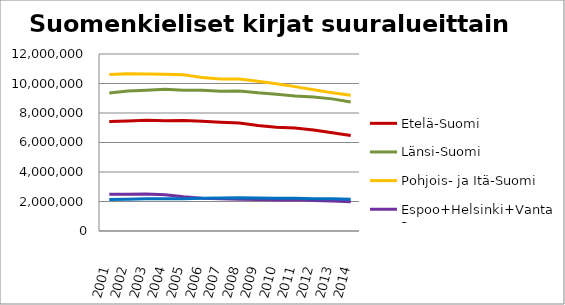
| Category | Etelä-Suomi | Länsi-Suomi | Pohjois- ja Itä-Suomi | Espoo+Helsinki+Vantaa | Muu Uusimaa |
|---|---|---|---|---|---|
| 2001.0 | 7427465 | 9358423 | 10606272 | 2489051 | 2136193 |
| 2002.0 | 7465703 | 9485230 | 10656582 | 2497956 | 2160577 |
| 2003.0 | 7504008 | 9540448 | 10639796 | 2510049 | 2187037 |
| 2004.0 | 7474227 | 9605493 | 10624606 | 2456765 | 2183677 |
| 2005.0 | 7493954 | 9547980 | 10588069 | 2318979 | 2184793 |
| 2006.0 | 7439095 | 9548500 | 10407988 | 2227404 | 2211970 |
| 2007.0 | 7376444 | 9469001 | 10311653 | 2189698 | 2234349 |
| 2008.0 | 7322106 | 9494154 | 10300192 | 2155638 | 2248749 |
| 2009.0 | 7153120 | 9365936 | 10154533 | 2129533 | 2232992 |
| 2010.0 | 7029263 | 9272679 | 9987277 | 2106074 | 2220681 |
| 2011.0 | 6977343 | 9155269 | 9788194 | 2117324 | 2219726 |
| 2012.0 | 6840390 | 9081780 | 9574874 | 2074587 | 2189748 |
| 2013.0 | 6667938 | 8957594 | 9377468 | 2040767 | 2179519 |
| 2014.0 | 6479472 | 8742856 | 9197948 | 1988900 | 2151333 |